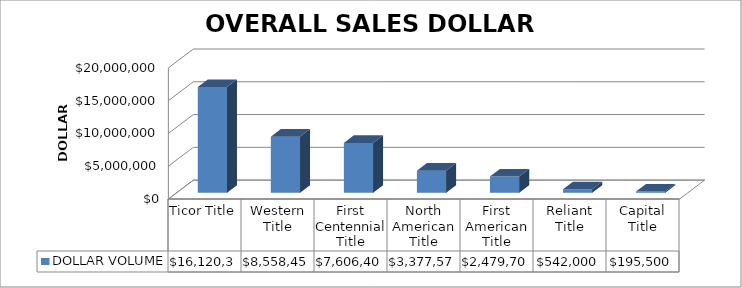
| Category | DOLLAR VOLUME |
|---|---|
| Ticor Title | 16120396 |
| Western Title | 8558452.52 |
| First Centennial Title | 7606408 |
| North American Title | 3377579 |
| First American Title | 2479700 |
| Reliant Title | 542000 |
| Capital Title | 195500 |